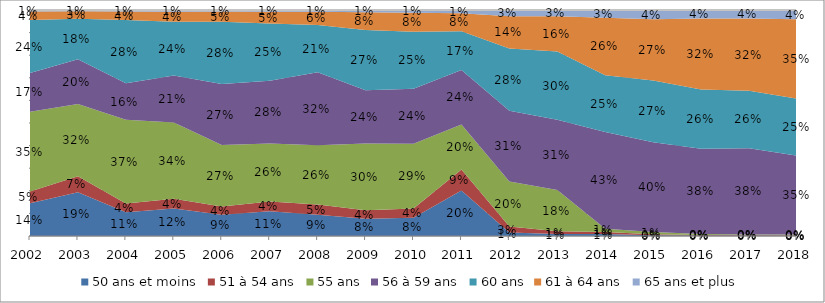
| Category | 50 ans et moins | 51 à 54 ans | 55 ans | 56 à 59 ans | 60 ans | 61 à 64 ans | 65 ans et plus |
|---|---|---|---|---|---|---|---|
| 2002.0 | 0.145 | 0.052 | 0.353 | 0.171 | 0.235 | 0.037 | 0.007 |
| 2003.0 | 0.193 | 0.072 | 0.319 | 0.198 | 0.179 | 0.034 | 0.005 |
| 2004.0 | 0.106 | 0.039 | 0.37 | 0.161 | 0.28 | 0.038 | 0.006 |
| 2005.0 | 0.122 | 0.043 | 0.338 | 0.208 | 0.238 | 0.045 | 0.007 |
| 2006.0 | 0.094 | 0.036 | 0.272 | 0.271 | 0.275 | 0.045 | 0.007 |
| 2007.0 | 0.109 | 0.043 | 0.257 | 0.278 | 0.253 | 0.052 | 0.008 |
| 2008.0 | 0.094 | 0.046 | 0.262 | 0.323 | 0.209 | 0.058 | 0.008 |
| 2009.0 | 0.076 | 0.038 | 0.296 | 0.236 | 0.266 | 0.078 | 0.01 |
| 2010.0 | 0.08 | 0.041 | 0.286 | 0.244 | 0.252 | 0.084 | 0.012 |
| 2011.0 | 0.201 | 0.093 | 0.199 | 0.241 | 0.172 | 0.08 | 0.014 |
| 2012.0 | 0.015 | 0.027 | 0.199 | 0.313 | 0.276 | 0.142 | 0.028 |
| 2013.0 | 0.009 | 0.012 | 0.182 | 0.311 | 0.302 | 0.157 | 0.027 |
| 2014.0 | 0.009 | 0.009 | 0.014 | 0.429 | 0.251 | 0.255 | 0.034 |
| 2015.0 | 0.003 | 0.004 | 0.01 | 0.397 | 0.274 | 0.271 | 0.041 |
| 2016.0 | 0.002 | 0.002 | 0.005 | 0.377 | 0.262 | 0.315 | 0.037 |
| 2017.0 | 0.002 | 0.003 | 0.002 | 0.381 | 0.255 | 0.319 | 0.037 |
| 2018.0 | 0.001 | 0.002 | 0.003 | 0.349 | 0.252 | 0.351 | 0.041 |